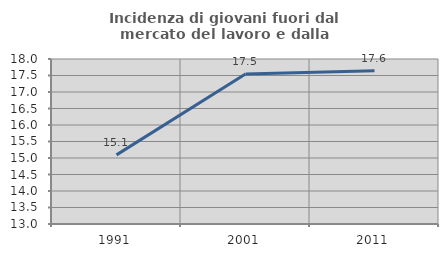
| Category | Incidenza di giovani fuori dal mercato del lavoro e dalla formazione  |
|---|---|
| 1991.0 | 15.094 |
| 2001.0 | 17.544 |
| 2011.0 | 17.647 |